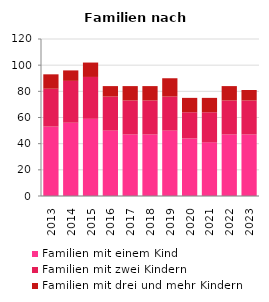
| Category | Familien mit einem Kind | Familien mit zwei Kindern | Familien mit drei und mehr Kindern |
|---|---|---|---|
| 2013.0 | 53 | 29 | 11 |
| 2014.0 | 56 | 32 | 8 |
| 2015.0 | 59 | 32 | 11 |
| 2016.0 | 50 | 26 | 8 |
| 2017.0 | 47 | 26 | 11 |
| 2018.0 | 47 | 26 | 11 |
| 2019.0 | 50 | 26 | 14 |
| 2020.0 | 44 | 20 | 11 |
| 2021.0 | 41 | 23 | 11 |
| 2022.0 | 47 | 26 | 11 |
| 2023.0 | 47 | 26 | 8 |